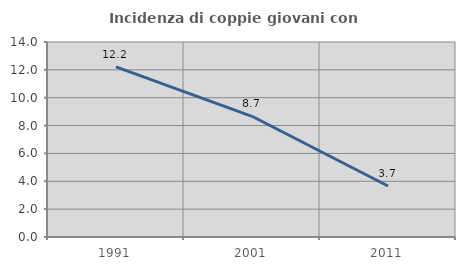
| Category | Incidenza di coppie giovani con figli |
|---|---|
| 1991.0 | 12.219 |
| 2001.0 | 8.667 |
| 2011.0 | 3.663 |